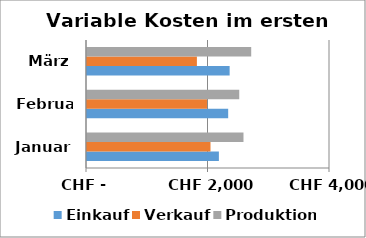
| Category | Einkauf | Verkauf | Produktion |
|---|---|---|---|
| Januar | 2171 | 2033 | 2576 |
| Februar | 2324 | 1975 | 2506 |
| März | 2348 | 1809 | 2703 |